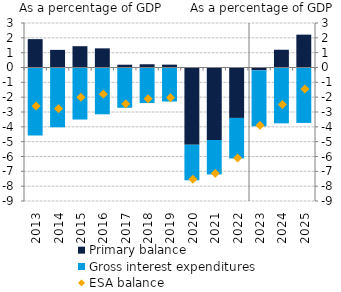
| Category | Primary balance | Gross interest expenditures |
|---|---|---|
| 2013.0 | 1.912 | -4.51 |
| 2014.0 | 1.188 | -3.963 |
| 2015.0 | 1.436 | -3.44 |
| 2016.0 | 1.291 | -3.088 |
| 2017.0 | 0.188 | -2.647 |
| 2018.0 | 0.218 | -2.331 |
| 2019.0 | 0.194 | -2.225 |
| 2020.0 | -5.208 | -2.328 |
| 2021.0 | -4.888 | -2.255 |
| 2022.0 | -3.4 | -2.665 |
| 2023.0 | -0.189 | -3.707 |
| 2024.0 | 1.198 | -3.696 |
| 2025.0 | 2.215 | -3.669 |